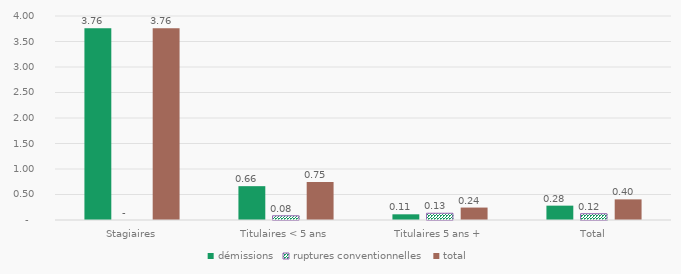
| Category | démissions | ruptures conventionnelles | total |
|---|---|---|---|
| Stagiaires | 3.76 | 0 | 3.76 |
| Titulaires < 5 ans | 0.663 | 0.082 | 0.746 |
| Titulaires 5 ans + | 0.111 | 0.132 | 0.244 |
| Total | 0.281 | 0.123 | 0.404 |